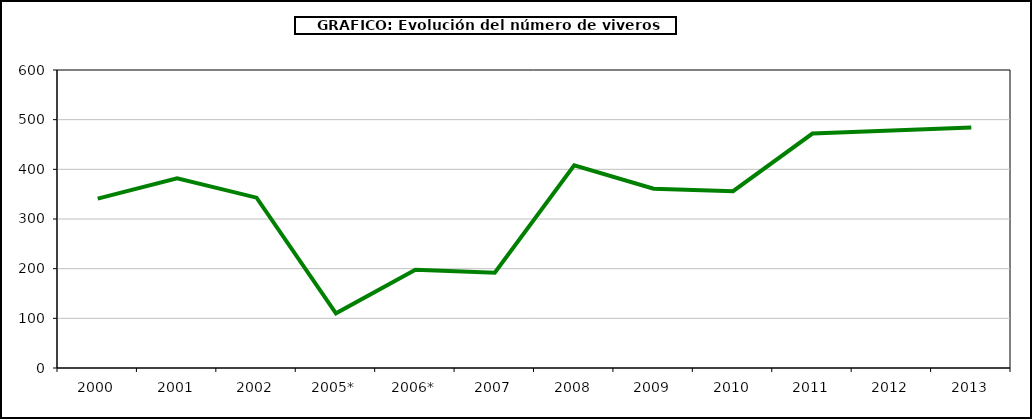
| Category | Series 0 |
|---|---|
| 2000 | 341 |
| 2001 | 382 |
| 2002 | 343 |
| 2005* | 110 |
| 2006* | 198 |
| 2007 | 192 |
| 2008 | 408 |
| 2009 | 361 |
| 2010 | 356 |
| 2011 | 472 |
| 2012 | 478 |
| 2013 | 484 |